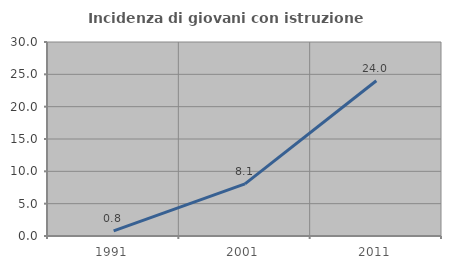
| Category | Incidenza di giovani con istruzione universitaria |
|---|---|
| 1991.0 | 0.794 |
| 2001.0 | 8.065 |
| 2011.0 | 24 |